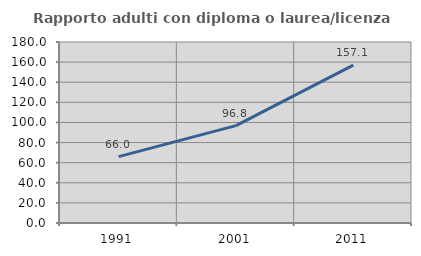
| Category | Rapporto adulti con diploma o laurea/licenza media  |
|---|---|
| 1991.0 | 66 |
| 2001.0 | 96.809 |
| 2011.0 | 157.066 |